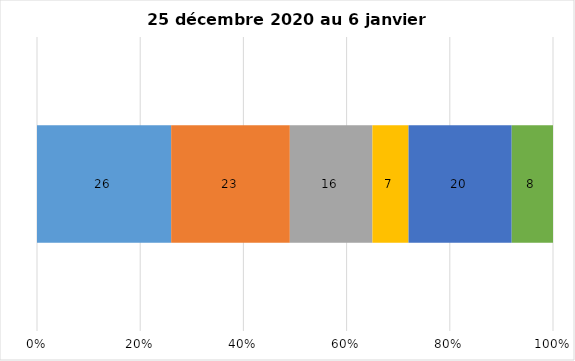
| Category | Plusieurs fois par jour | Une fois par jour | Quelques fois par semaine   | Une fois par semaine ou moins   |  Jamais   |  Je n’utilise pas les médias sociaux |
|---|---|---|---|---|---|---|
| 0 | 26 | 23 | 16 | 7 | 20 | 8 |